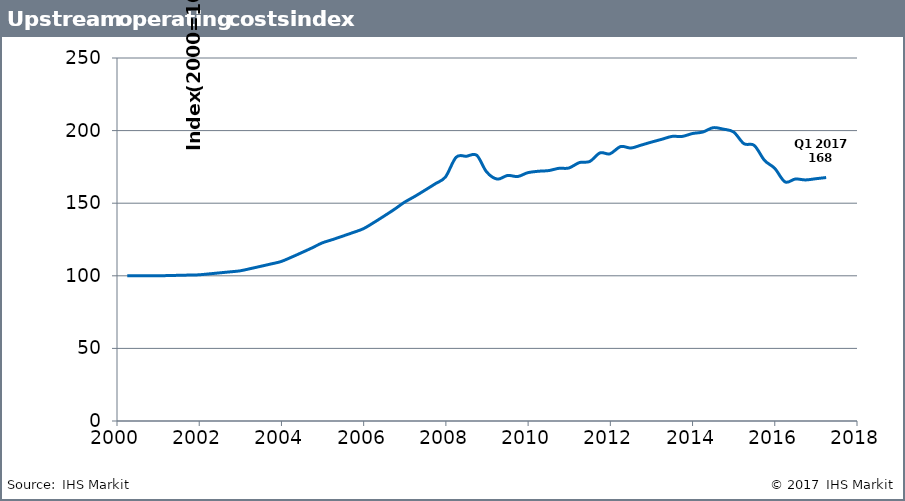
| Category | UOCI |
|---|---|
| 2000.25 | 100 |
| 2000.5 | 100 |
| 2000.75 | 100 |
| 2000.99 | 100 |
| 2001.25 | 100.168 |
| 2001.5 | 100.336 |
| 2001.75 | 100.504 |
| 2001.99 | 100.673 |
| 2002.25 | 101.35 |
| 2002.5 | 102.031 |
| 2002.75 | 102.717 |
| 2002.99 | 103.407 |
| 2003.25 | 104.974 |
| 2003.5 | 106.564 |
| 2003.75 | 108.178 |
| 2003.99 | 109.817 |
| 2004.25 | 112.892 |
| 2004.5 | 116.054 |
| 2004.75 | 119.304 |
| 2004.99 | 122.645 |
| 2005.25 | 125.012 |
| 2005.5 | 127.424 |
| 2005.75 | 129.883 |
| 2005.99 | 132.389 |
| 2006.25 | 136.725 |
| 2006.5 | 141.203 |
| 2006.75 | 145.827 |
| 2006.99 | 150.604 |
| 2007.25 | 154.794 |
| 2007.5 | 159.102 |
| 2007.75 | 163.529 |
| 2007.99 | 168.079 |
| 2008.25 | 181.682 |
| 2008.5 | 182.338 |
| 2008.75 | 182.995 |
| 2008.99 | 171.562 |
| 2009.25 | 166.606 |
| 2009.5 | 169.095 |
| 2009.75 | 168.387 |
| 2009.99 | 171 |
| 2010.25 | 172 |
| 2010.5 | 172.459 |
| 2010.75 | 174.027 |
| 2010.99 | 174.224 |
| 2011.25 | 178 |
| 2011.5 | 178.745 |
| 2011.75 | 184.666 |
| 2011.99 | 184 |
| 2012.25 | 189 |
| 2012.5 | 188 |
| 2012.75 | 190 |
| 2012.99 | 192 |
| 2013.25 | 194 |
| 2013.5 | 196 |
| 2013.75 | 196 |
| 2014.0 | 198 |
| 2014.25 | 199 |
| 2014.5 | 202 |
| 2014.75 | 201 |
| 2015.0 | 199 |
| 2015.25 | 191 |
| 2015.5 | 189.831 |
| 2015.75 | 179.516 |
| 2016.0 | 173.97 |
| 2016.25 | 164.662 |
| 2016.5 | 166.644 |
| 2016.75 | 166.024 |
| 2017.0 | 166.862 |
| 2017.25 | 167.671 |